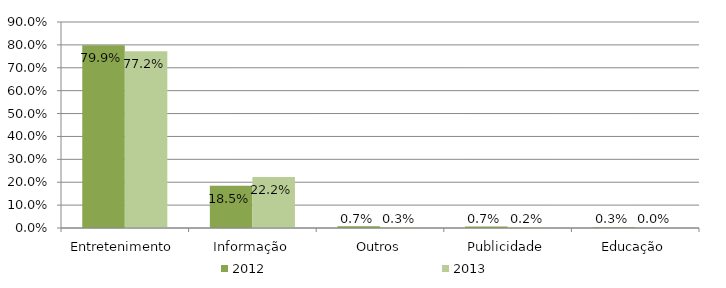
| Category | 2012 | 2013 |
|---|---|---|
| Entretenimento | 0.799 | 0.772 |
| Informação | 0.185 | 0.222 |
| Outros | 0.007 | 0.003 |
| Publicidade | 0.007 | 0.002 |
| Educação | 0.003 | 0 |